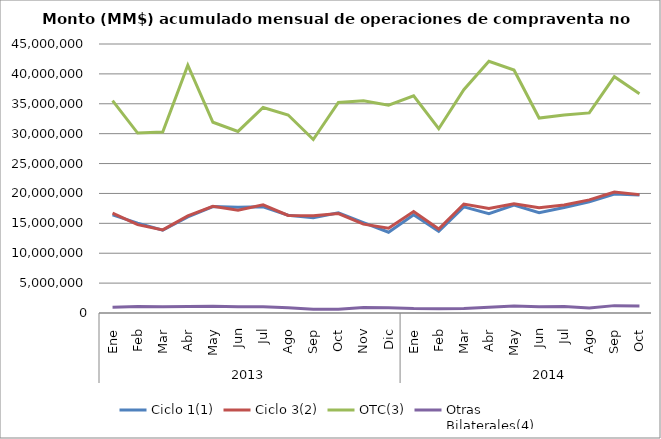
| Category | Ciclo 1(1) | Ciclo 3(2) | OTC(3) | Otras
Bilaterales(4) |
|---|---|---|---|---|
| 0 | 16417241.727 | 16700335.202 | 35523809.408 | 972958.086 |
| 1 | 15037741.172 | 14773657.586 | 30102338.851 | 1073496.596 |
| 2 | 13848943.779 | 13900402.205 | 30273669.122 | 1026617.054 |
| 3 | 16086096.035 | 16245696.168 | 41465554.082 | 1105720.368 |
| 4 | 17801790.619 | 17838763.351 | 31909646.654 | 1133512.85 |
| 5 | 17684542.956 | 17179330.609 | 30372188.279 | 1025162.543 |
| 6 | 17771623.451 | 18089502.524 | 34376831.202 | 1053340.718 |
| 7 | 16359818.954 | 16327115.519 | 33128143.288 | 882723.558 |
| 8 | 15949862.744 | 16281684.387 | 29025705.039 | 624893.462 |
| 9 | 16760948.703 | 16634867.291 | 35234004.542 | 641647.876 |
| 10 | 15133528.556 | 14863555.208 | 35512550.02 | 915020.525 |
| 11 | 13509827.678 | 14192849.668 | 34769513.126 | 877765.247 |
| 12 | 16434121.823 | 16973216.875 | 36341658.718 | 750147.378 |
| 13 | 13675521.943 | 14060199.134 | 30828680.35 | 721919.806 |
| 14 | 17760484.117 | 18231676.991 | 37344676.439 | 768460.999 |
| 15 | 16615436.994 | 17468955.339 | 42094978.158 | 945494.284 |
| 16 | 18046213.572 | 18258193.447 | 40638812.154 | 1185202.419 |
| 17 | 16777760.924 | 17604169.829 | 32614242.011 | 1051618.708 |
| 18 | 17653207.737 | 18067976.125 | 33107498.911 | 1069963.521 |
| 19 | 18582577.233 | 18927801.519 | 33476806.263 | 855141.972 |
| 20 | 19897365.776 | 20231545.747 | 39538700.233 | 1232916.988 |
| 21 | 19756659.053 | 19803460.861 | 36676651.963 | 1179870.422 |